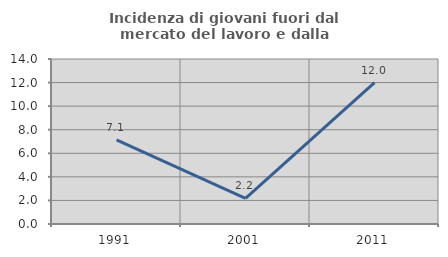
| Category | Incidenza di giovani fuori dal mercato del lavoro e dalla formazione  |
|---|---|
| 1991.0 | 7.143 |
| 2001.0 | 2.174 |
| 2011.0 | 12 |